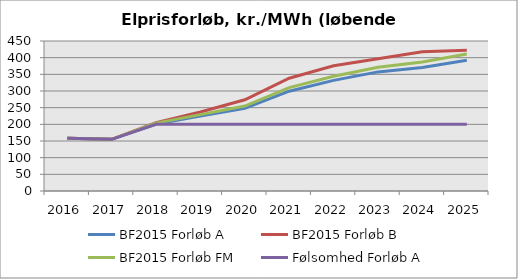
| Category | BF2015 Forløb A | BF2015 Forløb B | BF2015 Forløb FM | Følsomhed Forløb A |
|---|---|---|---|---|
| 2016.0 | 158 | 158 | 158 | 158 |
| 2017.0 | 155 | 155 | 155 | 155 |
| 2018.0 | 200.802 | 204.639 | 203.612 | 200 |
| 2019.0 | 224.867 | 237.153 | 229.159 | 200 |
| 2020.0 | 247.955 | 273.651 | 254.894 | 200 |
| 2021.0 | 299.341 | 338.44 | 310.282 | 200 |
| 2022.0 | 331.875 | 375.59 | 344.15 | 200 |
| 2023.0 | 357.325 | 397.048 | 371.025 | 200 |
| 2024.0 | 370.449 | 417.992 | 387.313 | 200 |
| 2025.0 | 392.542 | 422.217 | 411.148 | 200 |